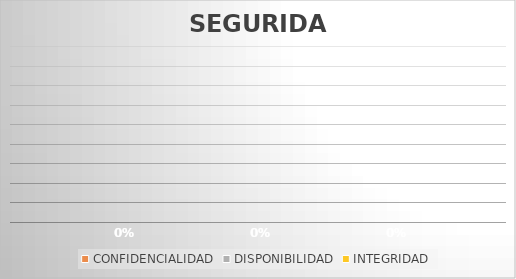
| Category | CONFIDENCIALIDAD | DISPONIBILIDAD | INTEGRIDAD |
|---|---|---|---|
| SEGURIDAD | 0 | 0 | 0 |